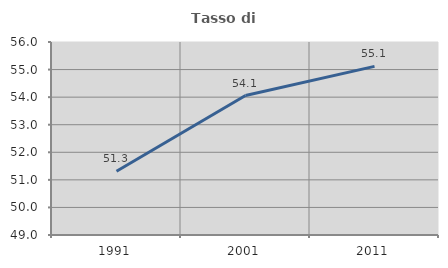
| Category | Tasso di occupazione   |
|---|---|
| 1991.0 | 51.313 |
| 2001.0 | 54.059 |
| 2011.0 | 55.116 |